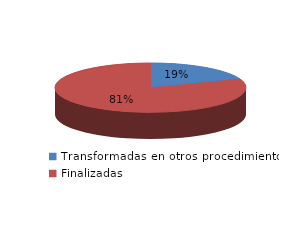
| Category | Series 0 |
|---|---|
| Transformadas en otros procedimientos | 3169 |
| Finalizadas | 13330 |